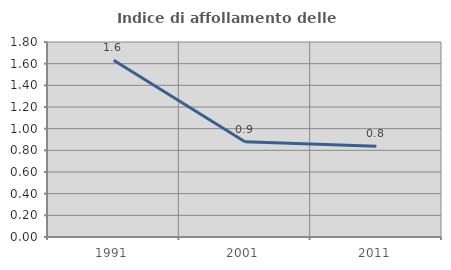
| Category | Indice di affollamento delle abitazioni  |
|---|---|
| 1991.0 | 1.632 |
| 2001.0 | 0.88 |
| 2011.0 | 0.837 |